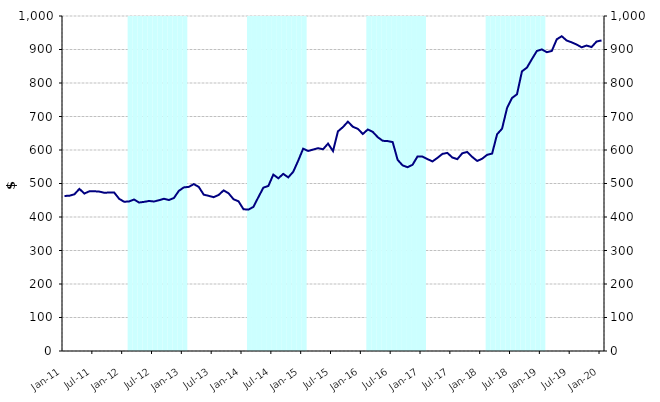
| Category | Series 1 |
|---|---|
| 0 | 0 |
| 1900-01-01 | 0 |
| 1900-01-02 | 0 |
| 1900-01-03 | 0 |
| 1900-01-04 | 0 |
| 1900-01-05 | 0 |
| 1900-01-06 | 0 |
| 1900-01-07 | 0 |
| 1900-01-08 | 0 |
| 1900-01-09 | 0 |
| 1900-01-10 | 0 |
| 1900-01-11 | 0 |
| 1900-01-12 | 0 |
| 1900-01-13 | 1000000000 |
| 1900-01-14 | 1000000000 |
| 1900-01-15 | 1000000000 |
| 1900-01-16 | 1000000000 |
| 1900-01-17 | 1000000000 |
| 1900-01-18 | 1000000000 |
| 1900-01-19 | 1000000000 |
| 1900-01-20 | 1000000000 |
| 1900-01-21 | 1000000000 |
| 1900-01-22 | 1000000000 |
| 1900-01-23 | 1000000000 |
| 1900-01-24 | 1000000000 |
| 1900-01-25 | 0 |
| 1900-01-26 | 0 |
| 1900-01-27 | 0 |
| 1900-01-28 | 0 |
| 1900-01-29 | 0 |
| 1900-01-30 | 0 |
| 1900-01-31 | 0 |
| 1900-02-01 | 0 |
| 1900-02-02 | 0 |
| 1900-02-03 | 0 |
| 1900-02-04 | 0 |
| 1900-02-05 | 0 |
| 1900-02-06 | 1000000000 |
| 1900-02-07 | 1000000000 |
| 1900-02-08 | 1000000000 |
| 1900-02-09 | 1000000000 |
| 1900-02-10 | 1000000000 |
| 1900-02-11 | 1000000000 |
| 1900-02-12 | 1000000000 |
| 1900-02-13 | 1000000000 |
| 1900-02-14 | 1000000000 |
| 1900-02-15 | 1000000000 |
| 1900-02-16 | 1000000000 |
| 1900-02-17 | 1000000000 |
| 1900-02-18 | 0 |
| 1900-02-19 | 0 |
| 1900-02-20 | 0 |
| 1900-02-21 | 0 |
| 1900-02-22 | 0 |
| 1900-02-23 | 0 |
| 1900-02-24 | 0 |
| 1900-02-25 | 0 |
| 1900-02-26 | 0 |
| 1900-02-27 | 0 |
| 1900-02-28 | 0 |
| 1900-02-28 | 0 |
| 1900-03-01 | 1000000000 |
| 1900-03-02 | 1000000000 |
| 1900-03-03 | 1000000000 |
| 1900-03-04 | 1000000000 |
| 1900-03-05 | 1000000000 |
| 1900-03-06 | 1000000000 |
| 1900-03-07 | 1000000000 |
| 1900-03-08 | 1000000000 |
| 1900-03-09 | 1000000000 |
| 1900-03-10 | 1000000000 |
| 1900-03-11 | 1000000000 |
| 1900-03-12 | 1000000000 |
| 1900-03-13 | 0 |
| 1900-03-14 | 0 |
| 1900-03-15 | 0 |
| 1900-03-16 | 0 |
| 1900-03-17 | 0 |
| 1900-03-18 | 0 |
| 1900-03-19 | 0 |
| 1900-03-20 | 0 |
| 1900-03-21 | 0 |
| 1900-03-22 | 0 |
| 1900-03-23 | 0 |
| 1900-03-24 | 0 |
| 1900-03-25 | 1000000000 |
| 1900-03-26 | 1000000000 |
| 1900-03-27 | 1000000000 |
| 1900-03-28 | 1000000000 |
| 1900-03-29 | 1000000000 |
| 1900-03-30 | 1000000000 |
| 1900-03-31 | 1000000000 |
| 1900-04-01 | 1000000000 |
| 1900-04-02 | 1000000000 |
| 1900-04-03 | 1000000000 |
| 1900-04-04 | 1000000000 |
| 1900-04-05 | 1000000000 |
| 1900-04-06 | 0 |
| 1900-04-07 | 0 |
| 1900-04-08 | 0 |
| 1900-04-09 | 0 |
| 1900-04-10 | 0 |
| 1900-04-11 | 0 |
| 1900-04-12 | 0 |
| 1900-04-13 | 0 |
| 1900-04-14 | 0 |
| 1900-04-15 | 0 |
| 1900-04-16 | 0 |
| 1900-04-17 | 0 |